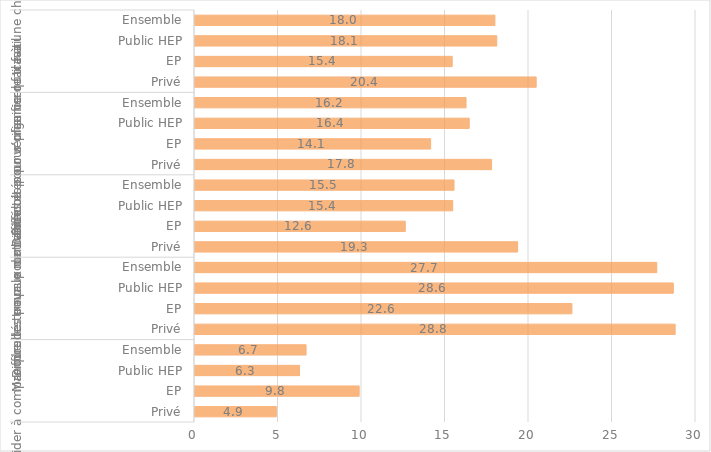
| Category | Souvent |
|---|---|
| 0 | 4.87 |
| 1 | 9.83 |
| 2 | 6.26 |
| 3 | 6.65 |
| 4 | 28.75 |
| 5 | 22.57 |
| 6 | 28.64 |
| 7 | 27.65 |
| 8 | 19.32 |
| 9 | 12.59 |
| 10 | 15.43 |
| 11 | 15.51 |
| 12 | 17.76 |
| 13 | 14.11 |
| 14 | 16.42 |
| 15 | 16.23 |
| 16 | 20.43 |
| 17 | 15.4 |
| 18 | 18.07 |
| 19 | 17.96 |